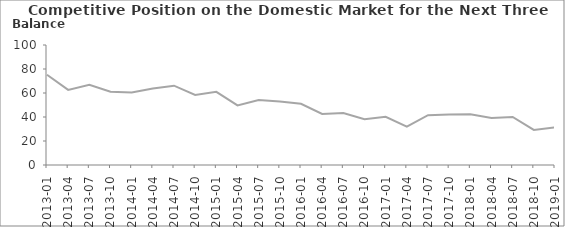
| Category | Balance |
|---|---|
| 2013-01 | 75.2 |
| 2013-04 | 62.6 |
| 2013-07 | 66.9 |
| 2013-10 | 61 |
| 2014-01 | 60.5 |
| 2014-04 | 63.8 |
| 2014-07 | 66.1 |
| 2014-10 | 58.4 |
| 2015-01 | 61 |
| 2015-04 | 49.7 |
| 2015-07 | 54.1 |
| 2015-10 | 52.9 |
| 2016-01 | 51 |
| 2016-04 | 42.5 |
| 2016-07 | 43.3 |
| 2016-10 | 38.2 |
| 2017-01 | 40.1 |
| 2017-04 | 32 |
| 2017-07 | 41.5 |
| 2017-10 | 42 |
| 2018-01 | 42.2 |
| 2018-04 | 39.1 |
| 2018-07 | 40 |
| 2018-10 | 29.2 |
| 2019-01 | 31.3 |